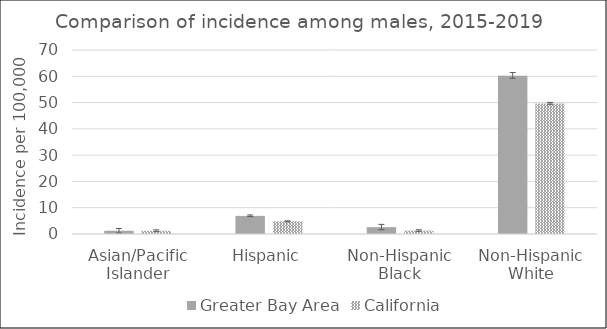
| Category | Greater Bay Area | California | SEER 18 |
|---|---|---|---|
| Asian/Pacific Islander | 1.24 | 1.24 |  |
| Hispanic | 6.9 | 4.81 |  |
| Non-Hispanic Black | 2.6 | 1.3 |  |
| Non-Hispanic White | 60.18 | 49.67 |  |